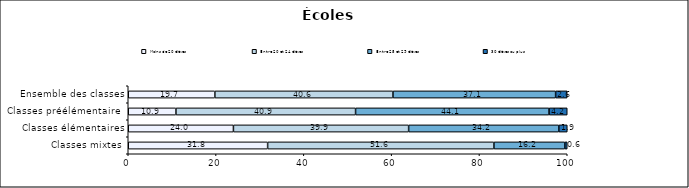
| Category | Moins de 20 élèves | Entre 20 et 24 élèves | Entre 25 et 29 élèves | 30 élèves ou plus |
|---|---|---|---|---|
| Classes mixtes | 31.75 | 51.55 | 16.15 | 0.55 |
| Classes élémentaires | 23.96 | 39.91 | 34.21 | 1.93 |
| Classes préélémentaires | 10.86 | 40.92 | 44.07 | 4.15 |
| Ensemble des classes | 19.73 | 40.57 | 37.05 | 2.64 |